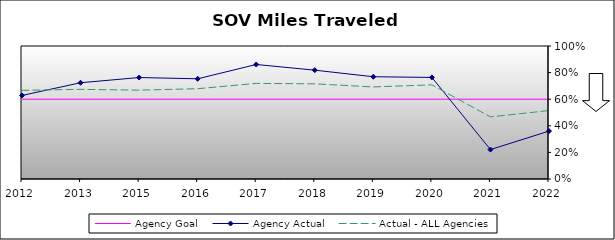
| Category | Agency Goal | Agency Actual | Actual - ALL Agencies |
|---|---|---|---|
| 2012.0 | 0.6 | 0.628 | 0.666 |
| 2013.0 | 0.6 | 0.724 | 0.674 |
| 2015.0 | 0.6 | 0.763 | 0.668 |
| 2016.0 | 0.6 | 0.753 | 0.679 |
| 2017.0 | 0.6 | 0.861 | 0.719 |
| 2018.0 | 0.6 | 0.818 | 0.715 |
| 2019.0 | 0.6 | 0.769 | 0.692 |
| 2020.0 | 0.6 | 0.764 | 0.708 |
| 2021.0 | 0.6 | 0.221 | 0.467 |
| 2022.0 | 0.6 | 0.36 | 0.515 |